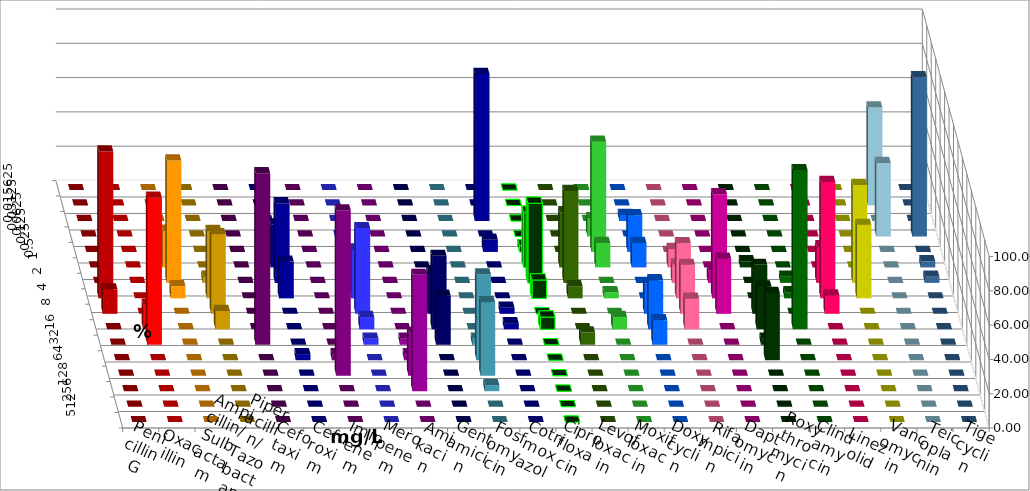
| Category | Penicillin G | Oxacillin | Ampicillin/ Sulbactam | Piperacillin/ Tazobactam | Cefotaxim | Cefuroxim | Imipenem | Meropenem | Amikacin | Gentamicin | Fosfomycin | Cotrimoxazol | Ciprofloxacin | Levofloxacin | Moxifloxacin | Doxycyclin | Rifampicin | Daptomycin | Roxythromycin | Clindamycin | Linezolid | Vancomycin | Teicoplanin | Tigecyclin |
|---|---|---|---|---|---|---|---|---|---|---|---|---|---|---|---|---|---|---|---|---|---|---|---|---|
| 0.015625 | 0 | 0 | 0 | 0 | 0 | 0 | 0 | 0 | 0 | 0 | 0 | 0 | 0 | 0 | 0 | 0 | 0 | 0 | 0 | 0 | 0 | 0 | 0 | 0 |
| 0.03125 | 0 | 0 | 0 | 0 | 0 | 0 | 0 | 0 | 0 | 0 | 0 | 0 | 0 | 0 | 0 | 0 | 0 | 0 | 0 | 0 | 0 | 0 | 0 | 57.143 |
| 0.0625 | 0 | 0 | 0 | 0 | 0 | 0 | 0 | 0 | 0 | 0 | 0 | 85.714 | 0 | 0 | 0 | 3.571 | 0 | 0 | 0 | 0 | 0 | 0 | 0 | 0 |
| 0.125 | 0 | 0 | 0 | 0 | 0 | 0 | 0 | 0 | 0 | 0 | 0 | 0 | 0 | 0 | 10.714 | 0 | 0 | 0 | 0 | 0 | 0 | 0 | 92.857 | 42.857 |
| 0.25 | 0 | 0 | 0 | 0 | 0 | 0 | 3.571 | 0 | 0 | 0 | 0 | 7.143 | 3.571 | 0 | 64.286 | 21.429 | 0 | 0 | 0 | 0 | 0 | 0 | 0 | 0 |
| 0.5 | 0 | 0 | 21.429 | 0 | 0 | 0 | 25 | 7.143 | 0 | 0 | 0 | 0 | 32.143 | 32.143 | 14.286 | 14.286 | 10.714 | 0 | 3.571 | 0 | 0 | 0 | 3.571 | 0 |
| 1.0 | 0 | 0 | 71.429 | 3.571 | 0 | 0 | 46.429 | 3.571 | 0 | 0 | 0 | 0 | 46.429 | 53.571 | 0 | 0 | 10.714 | 7.143 | 0 | 3.571 | 21.429 | 57.143 | 3.571 | 0 |
| 2.0 | 85.714 | 0 | 7.143 | 39.286 | 0 | 0 | 21.429 | 28.571 | 0 | 3.571 | 0 | 0 | 10.714 | 7.143 | 3.571 | 0 | 32.143 | 60.714 | 0 | 3.571 | 67.857 | 42.857 | 0 | 0 |
| 4.0 | 14.286 | 0 | 0 | 46.429 | 0 | 0 | 0 | 50 | 0 | 25 | 0 | 3.571 | 0 | 0 | 0 | 17.857 | 28.571 | 32.143 | 28.571 | 0 | 10.714 | 0 | 0 | 0 |
| 8.0 | 0 | 14.286 | 0 | 10.714 | 0 | 0 | 0 | 7.143 | 0 | 42.857 | 0 | 3.571 | 7.143 | 0 | 7.143 | 28.571 | 17.857 | 0 | 25 | 92.857 | 0 | 0 | 0 | 0 |
| 16.0 | 0 | 85.714 | 0 | 0 | 100 | 0 | 0 | 3.571 | 3.571 | 28.571 | 3.571 | 0 | 0 | 7.143 | 0 | 14.286 | 0 | 0 | 3.571 | 0 | 0 | 0 | 0 | 0 |
| 32.0 | 0 | 0 | 0 | 0 | 0 | 3.571 | 3.571 | 0 | 3.571 | 0 | 50 | 0 | 0 | 0 | 0 | 0 | 0 | 0 | 39.286 | 0 | 0 | 0 | 0 | 0 |
| 64.0 | 0 | 0 | 0 | 0 | 0 | 96.429 | 0 | 0 | 25 | 0 | 42.857 | 0 | 0 | 0 | 0 | 0 | 0 | 0 | 0 | 0 | 0 | 0 | 0 | 0 |
| 128.0 | 0 | 0 | 0 | 0 | 0 | 0 | 0 | 0 | 67.857 | 0 | 3.571 | 0 | 0 | 0 | 0 | 0 | 0 | 0 | 0 | 0 | 0 | 0 | 0 | 0 |
| 256.0 | 0 | 0 | 0 | 0 | 0 | 0 | 0 | 0 | 0 | 0 | 0 | 0 | 0 | 0 | 0 | 0 | 0 | 0 | 0 | 0 | 0 | 0 | 0 | 0 |
| 512.0 | 0 | 0 | 0 | 0 | 0 | 0 | 0 | 0 | 0 | 0 | 0 | 0 | 0 | 0 | 0 | 0 | 0 | 0 | 0 | 0 | 0 | 0 | 0 | 0 |